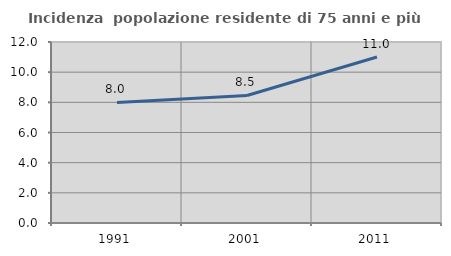
| Category | Incidenza  popolazione residente di 75 anni e più |
|---|---|
| 1991.0 | 7.995 |
| 2001.0 | 8.456 |
| 2011.0 | 11.009 |